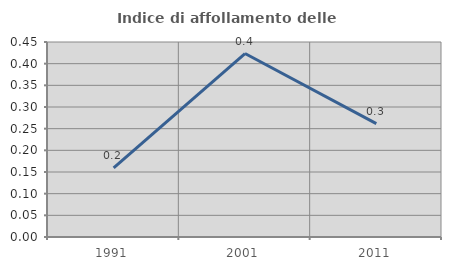
| Category | Indice di affollamento delle abitazioni  |
|---|---|
| 1991.0 | 0.16 |
| 2001.0 | 0.423 |
| 2011.0 | 0.262 |